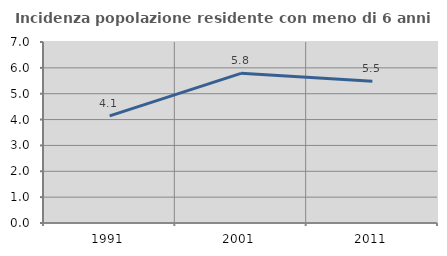
| Category | Incidenza popolazione residente con meno di 6 anni |
|---|---|
| 1991.0 | 4.145 |
| 2001.0 | 5.787 |
| 2011.0 | 5.481 |